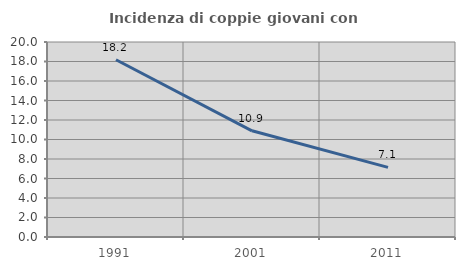
| Category | Incidenza di coppie giovani con figli |
|---|---|
| 1991.0 | 18.182 |
| 2001.0 | 10.892 |
| 2011.0 | 7.14 |